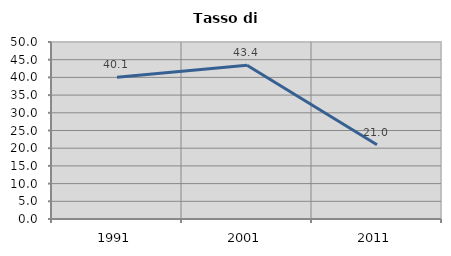
| Category | Tasso di disoccupazione   |
|---|---|
| 1991.0 | 40.065 |
| 2001.0 | 43.416 |
| 2011.0 | 20.992 |